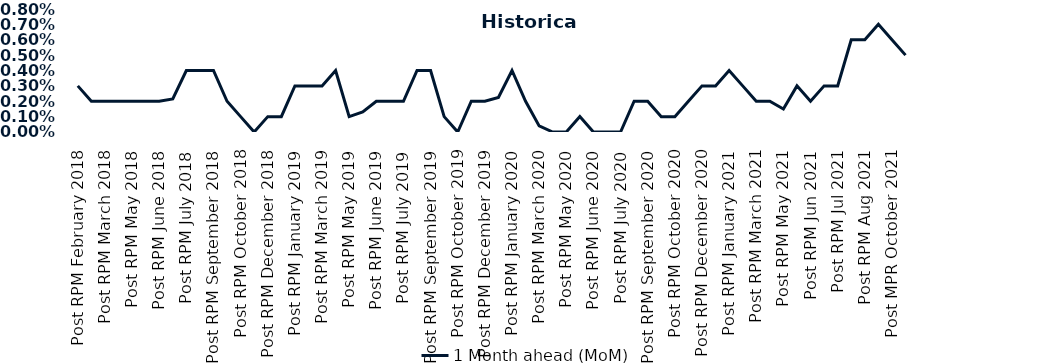
| Category | 1 Month ahead (MoM) |
|---|---|
| Post RPM February 2018 | 0.003 |
| Pre RPM March 2018 | 0.002 |
| Post RPM March 2018 | 0.002 |
| Pre RPM May 2018 | 0.002 |
| Post RPM May 2018 | 0.002 |
| Pre RPM June 2018 | 0.002 |
| Post RPM June 2018 | 0.002 |
| Pre RPM July 2018 | 0.002 |
| Post RPM July 2018 | 0.004 |
| Pre RPM September 2018 | 0.004 |
| Post RPM September 2018 | 0.004 |
| Pre RPM October 2018 | 0.002 |
| Post RPM October 2018 | 0.001 |
| Pre RPM December 2018 | 0 |
| Post RPM December 2018 | 0.001 |
| Pre RPM January 2019 | 0.001 |
| Post RPM January 2019 | 0.003 |
| Pre RPM March 2019 | 0.003 |
| Post RPM March 2019 | 0.003 |
| Pre RPM May 2019 | 0.004 |
| Post RPM May 2019 | 0.001 |
| Pre RPM June 2019 | 0.001 |
| Post RPM June 2019 | 0.002 |
| Pre RPM July 2019 | 0.002 |
| Post RPM July 2019 | 0.002 |
| Pre RPM September 2019 | 0.004 |
| Post RPM September 2019 | 0.004 |
| Pre RPM October 2019 | 0.001 |
| Post RPM October 2019 | 0 |
| Pre RPM December 2019 | 0.002 |
| Post RPM December 2019 | 0.002 |
| Pre RPM January 2020 | 0.002 |
| Post RPM January 2020 | 0.004 |
| Pre RPM March 2020 | 0.002 |
| Post RPM March 2020 | 0 |
| Pre RPM May 2020 | 0 |
| Post RPM May 2020 | 0 |
| Pre RPM June 2020 | 0.001 |
| Post RPM June 2020 | 0 |
| Pre RPM July 2020 | 0 |
| Post RPM July 2020 | 0 |
| Pre RPM September 2020 | 0.002 |
| Post RPM September 2020 | 0.002 |
| Pre RPM October 2020 | 0.001 |
| Post RPM October 2020 | 0.001 |
| Pre RPM December 2020 | 0.002 |
|  Post RPM December 2020 | 0.003 |
| Pre RPM January 2021 | 0.003 |
| Post RPM January 2021 | 0.004 |
|  Pre RPM March 2021 | 0.003 |
|  Post RPM March 2021 | 0.002 |
|  Pre RPM May 2021 | 0.002 |
|  Post RPM May 2021 | 0.002 |
|  Pre RPM Jun 2021 | 0.003 |
|   Post RPM Jun 2021 | 0.002 |
| Pre RPM Jul 2021 | 0.003 |
|  Post RPM Jul 2021 | 0.003 |
| Pre RPM Aug 2021 | 0.006 |
|  Post RPM Aug 2021 | 0.006 |
| Pre MPR October 2021 | 0.007 |
| Post MPR October 2021 | 0.006 |
| Pre MPR December 2021 | 0.005 |